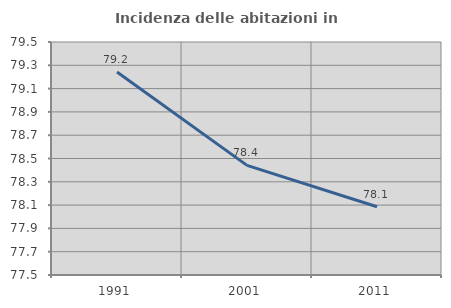
| Category | Incidenza delle abitazioni in proprietà  |
|---|---|
| 1991.0 | 79.242 |
| 2001.0 | 78.441 |
| 2011.0 | 78.086 |